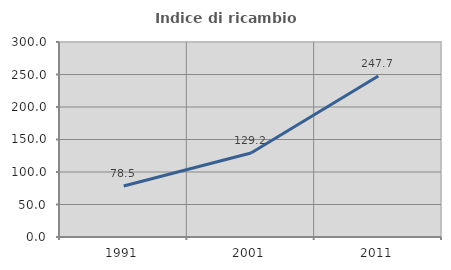
| Category | Indice di ricambio occupazionale  |
|---|---|
| 1991.0 | 78.543 |
| 2001.0 | 129.184 |
| 2011.0 | 247.71 |